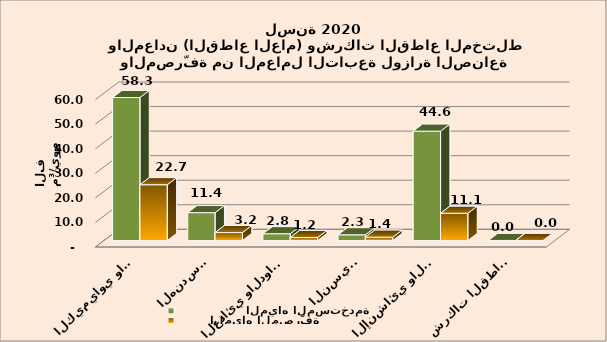
| Category |                  المياه المستخدمة                   |         المياه المصرّفة                   |
|---|---|---|
| الكيمياوي والبتروكيمياوي | 58.25 | 22.727 |
| الهندسي  | 11.366 | 3.247 |
| الغذائي والدوائي | 2.78 | 1.22 |
| النسيجي | 2.341 | 1.374 |
| الإنشائي والخدمات الصناعية | 44.551 | 11.106 |
| شركات القطاع المختلط | 0.036 | 0.026 |